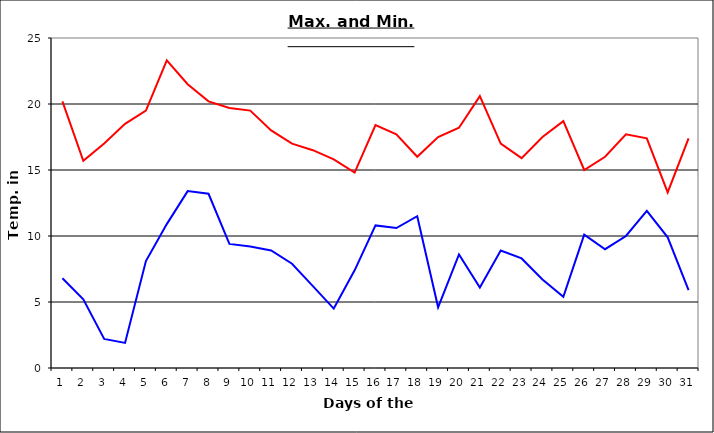
| Category | Series 0 | Series 1 |
|---|---|---|
| 0 | 20.2 | 6.8 |
| 1 | 15.7 | 5.2 |
| 2 | 17 | 2.2 |
| 3 | 18.5 | 1.9 |
| 4 | 19.5 | 8.1 |
| 5 | 23.3 | 10.9 |
| 6 | 21.5 | 13.4 |
| 7 | 20.2 | 13.2 |
| 8 | 19.7 | 9.4 |
| 9 | 19.5 | 9.2 |
| 10 | 18 | 8.9 |
| 11 | 17 | 7.9 |
| 12 | 16.5 | 6.2 |
| 13 | 15.8 | 4.5 |
| 14 | 14.8 | 7.4 |
| 15 | 18.4 | 10.8 |
| 16 | 17.7 | 10.6 |
| 17 | 16 | 11.5 |
| 18 | 17.5 | 4.6 |
| 19 | 18.2 | 8.6 |
| 20 | 20.6 | 6.1 |
| 21 | 17 | 8.9 |
| 22 | 15.9 | 8.3 |
| 23 | 17.5 | 6.7 |
| 24 | 18.7 | 5.4 |
| 25 | 15 | 10.1 |
| 26 | 16 | 9 |
| 27 | 17.7 | 10 |
| 28 | 17.4 | 11.9 |
| 29 | 13.3 | 9.9 |
| 30 | 17.4 | 5.9 |